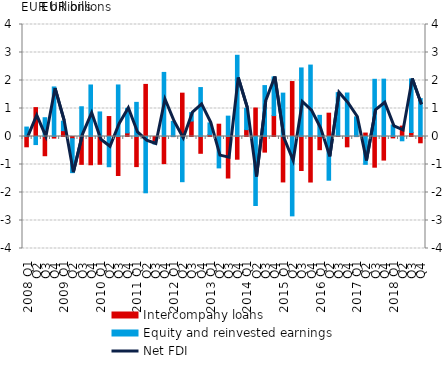
| Category | Intercompany loans | Equity and reinvested earnings |
|---|---|---|
| 2008 Q1 | -0.368 | 0.337 |
| Q2 | 1.032 | -0.288 |
| Q3 | -0.686 | 0.671 |
| Q4 | -0.057 | 1.77 |
| 2009 Q1 | 0.209 | 0.337 |
| Q2 | -0.079 | -1.212 |
| Q3 | -0.994 | 1.062 |
| Q4 | -1.01 | 1.84 |
| 2010 Q1 | -0.992 | 0.877 |
| Q2 | 0.713 | -1.08 |
| Q3 | -1.394 | 1.841 |
| Q4 | 0.13 | 0.876 |
| 2011 Q1 | -1.075 | 1.219 |
| Q2 | 1.86 | -2.011 |
| Q3 | -0.2 | -0.067 |
| Q4 | -0.969 | 2.289 |
| 2012 Q1 | -0.004 | 0.539 |
| Q2 | 1.548 | -1.614 |
| Q3 | 0.552 | 0.3 |
| Q4 | -0.6 | 1.748 |
| 2013 Q1 | 0.07 | 0.416 |
| Q2 | 0.439 | -1.121 |
| Q3 | -1.483 | 0.727 |
| Q4 | -0.811 | 2.9 |
| 2014 Q1 | 0.246 | 0.762 |
| Q2 | 1.018 | -2.464 |
| Q3 | -0.558 | 1.818 |
| Q4 | 0.746 | 1.38 |
| 2015 Q1 | -1.622 | 1.549 |
| Q2 | 1.963 | -2.834 |
| Q3 | -1.215 | 2.449 |
| Q4 | -1.626 | 2.551 |
| 2016 Q1 | -0.471 | 0.755 |
| Q2 | 0.833 | -1.561 |
| Q3 | 0.022 | 1.544 |
| Q4 | -0.369 | 1.553 |
| 2017 Q1 | -0.003 | 0.7 |
| Q2 | 0.123 | -0.994 |
| Q3 | -1.096 | 2.043 |
| Q4 | -0.842 | 2.048 |
| 2018 Q1 | -0.05 | 0.41 |
| Q2 | 0.371 | -0.153 |
| Q3 | 0.144 | 1.911 |
| Q4 | -0.225 | 1.356 |